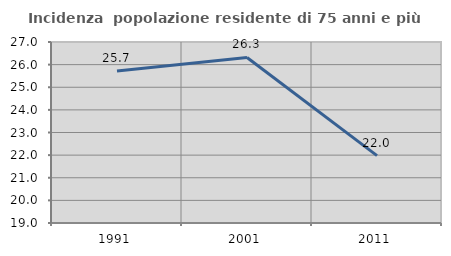
| Category | Incidenza  popolazione residente di 75 anni e più |
|---|---|
| 1991.0 | 25.714 |
| 2001.0 | 26.316 |
| 2011.0 | 21.978 |